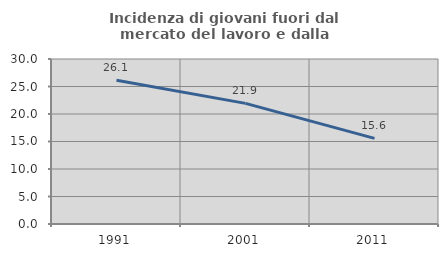
| Category | Incidenza di giovani fuori dal mercato del lavoro e dalla formazione  |
|---|---|
| 1991.0 | 26.143 |
| 2001.0 | 21.934 |
| 2011.0 | 15.578 |